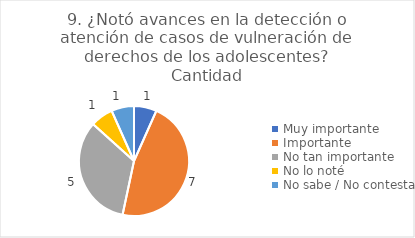
| Category | 9. ¿Notó avances en la detección o atención de casos de vulneración de derechos de los adolescentes? |
|---|---|
| Muy importante  | 0.067 |
| Importante  | 0.467 |
| No tan importante  | 0.333 |
| No lo noté  | 0.067 |
| No sabe / No contesta | 0.067 |